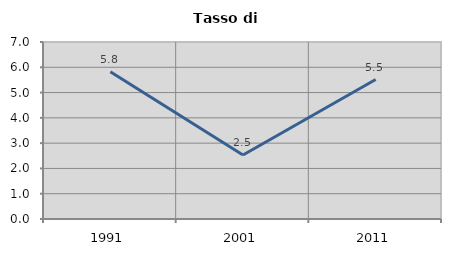
| Category | Tasso di disoccupazione   |
|---|---|
| 1991.0 | 5.819 |
| 2001.0 | 2.528 |
| 2011.0 | 5.515 |